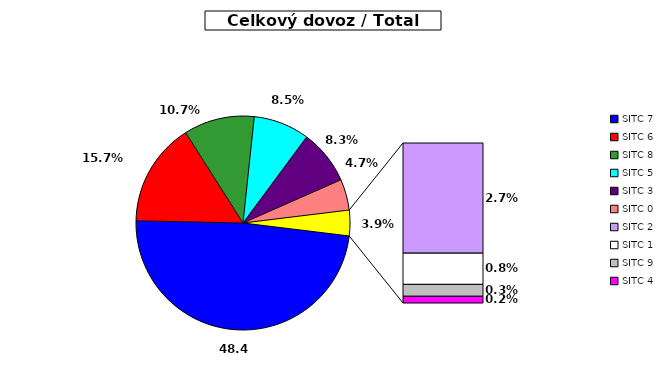
| Category | Series 0 |
|---|---|
| SITC 7 | 48.399 |
| SITC 6 | 15.657 |
| SITC 8 | 10.692 |
| SITC 5 | 8.452 |
| SITC 3 | 8.254 |
| SITC 0 | 4.672 |
| SITC 2 | 2.667 |
| SITC 1 | 0.756 |
| SITC 9 | 0.288 |
| SITC 4 | 0.163 |